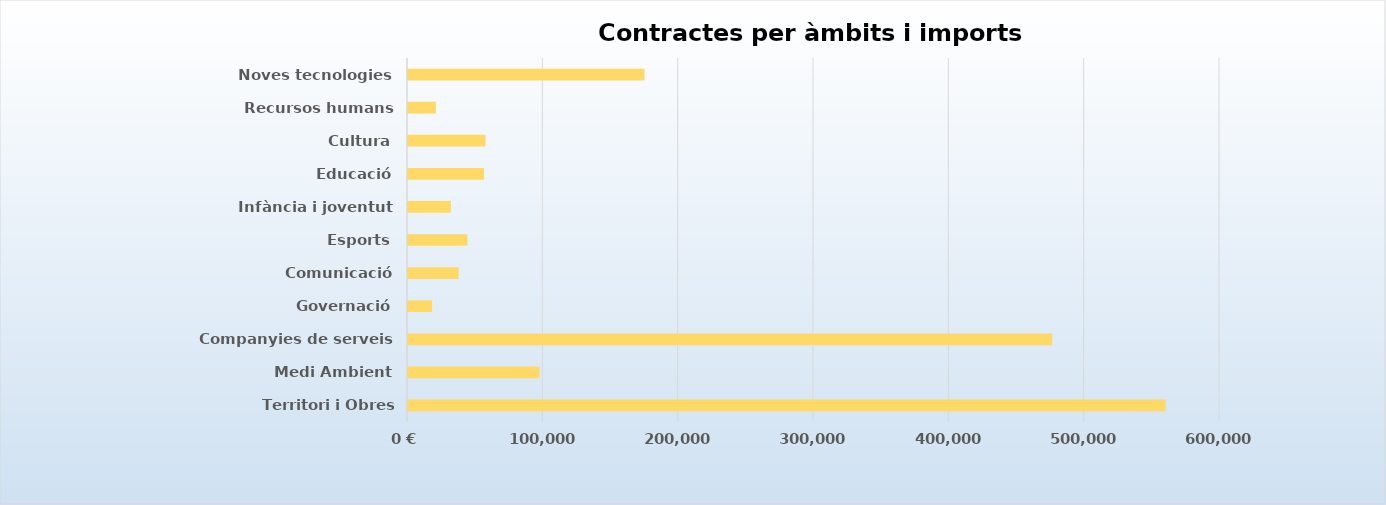
| Category | Import IVA exclòs |
|---|---|
| Territori i Obres públiques | 559765.48 |
| Medi Ambient | 97151.28 |
| Companyies de serveis | 476016.18 |
| Governació | 17826.48 |
| Comunicació | 37440 |
| Esports | 43888.7 |
| Infància i joventut | 31673 |
| Educació | 56210 |
| Cultura | 57300 |
| Recursos humans | 20602.9 |
| Noves tecnologies | 174773.5 |